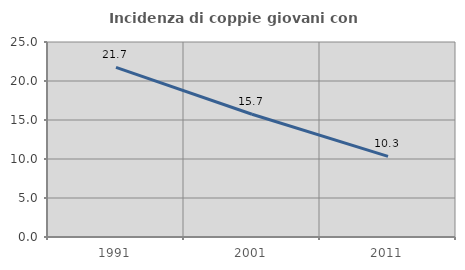
| Category | Incidenza di coppie giovani con figli |
|---|---|
| 1991.0 | 21.739 |
| 2001.0 | 15.733 |
| 2011.0 | 10.341 |